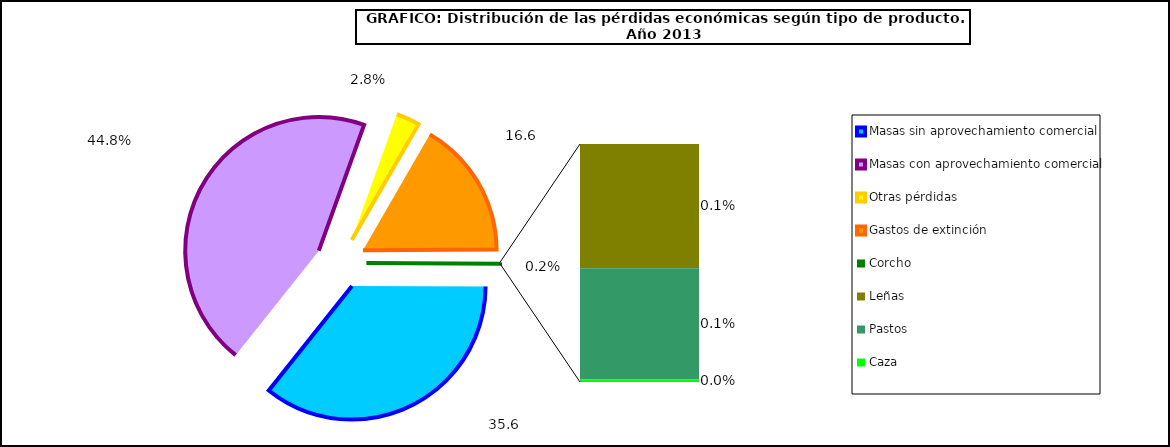
| Category | Series 0 |
|---|---|
| Masas sin aprovechamiento comercial | 35.619 |
| Masas con aprovechamiento comercial | 44.799 |
| Otras pérdidas | 2.844 |
| Gastos de extinción | 16.581 |
| Corcho | 0 |
| Leñas | 0.082 |
| Pastos | 0.073 |
| Caza | 0.002 |